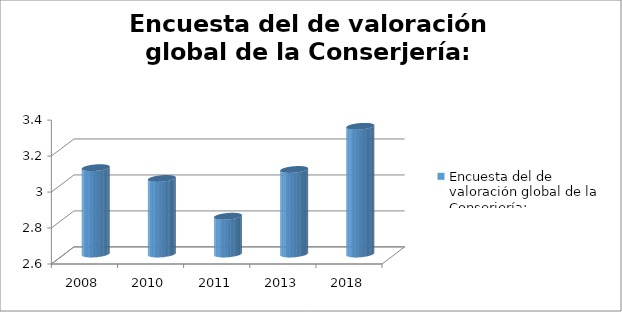
| Category | Encuesta del de valoración global de la Conserjería: |
|---|---|
| 2008.0 | 3.08 |
| 2010.0 | 3.02 |
| 2011.0 | 2.81 |
| 2013.0 | 3.07 |
| 2018.0 | 3.31 |